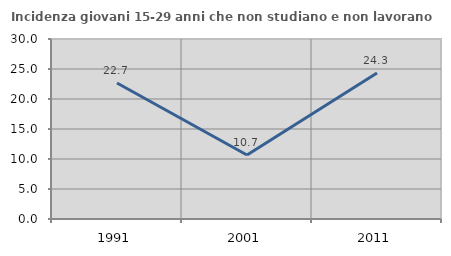
| Category | Incidenza giovani 15-29 anni che non studiano e non lavorano  |
|---|---|
| 1991.0 | 22.667 |
| 2001.0 | 10.667 |
| 2011.0 | 24.324 |